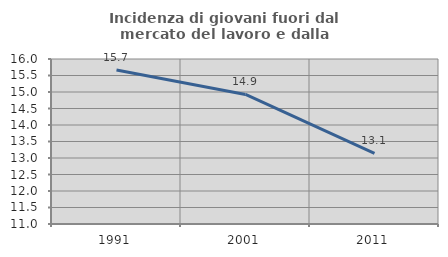
| Category | Incidenza di giovani fuori dal mercato del lavoro e dalla formazione  |
|---|---|
| 1991.0 | 15.667 |
| 2001.0 | 14.925 |
| 2011.0 | 13.141 |